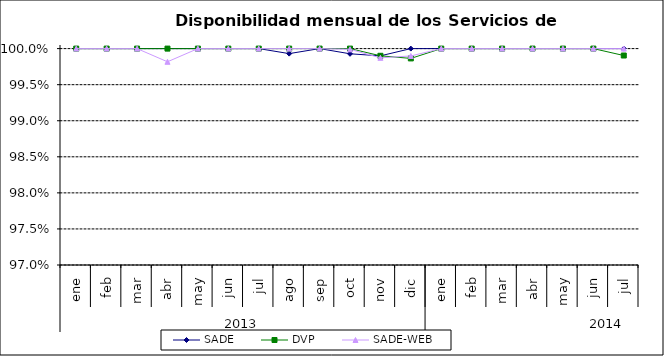
| Category | SADE | DVP | SADE-WEB |
|---|---|---|---|
| 0 | 1 | 1 | 1 |
| 1 | 1 | 1 | 1 |
| 2 | 1 | 1 | 1 |
| 3 | 1 | 1 | 0.998 |
| 4 | 1 | 1 | 1 |
| 5 | 1 | 1 | 1 |
| 6 | 1 | 1 | 1 |
| 7 | 0.999 | 1 | 1 |
| 8 | 1 | 1 | 1 |
| 9 | 0.999 | 1 | 1 |
| 10 | 0.999 | 0.999 | 0.999 |
| 11 | 1 | 0.999 | 0.999 |
| 12 | 1 | 1 | 1 |
| 13 | 1 | 1 | 1 |
| 14 | 1 | 1 | 1 |
| 15 | 1 | 1 | 1 |
| 16 | 1 | 1 | 1 |
| 17 | 1 | 1 | 1 |
| 18 | 1 | 0.999 | 1 |